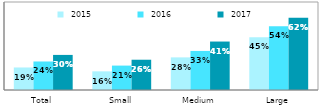
| Category |  2015 |  2016 |  2017 |
|---|---|---|---|
| Total | 0.192 | 0.243 | 0.299 |
| Small | 0.159 | 0.208 | 0.258 |
| Medium | 0.278 | 0.333 | 0.413 |
| Large | 0.45 | 0.544 | 0.616 |